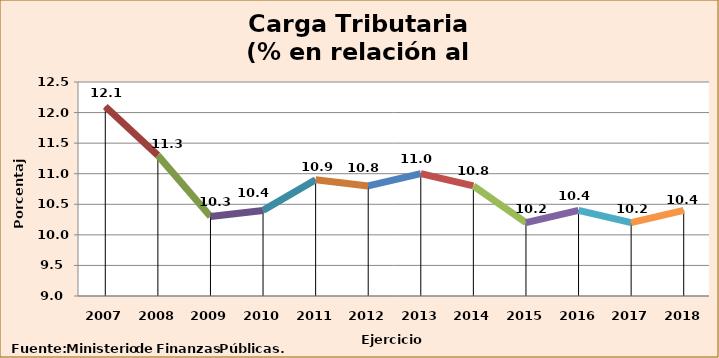
| Category | Series 0 |
|---|---|
| 2007 | 12.1 |
| 2008 | 11.3 |
| 2009 | 10.3 |
| 2010 | 10.4 |
| 2011 | 10.9 |
| 2012 | 10.8 |
| 2013 | 11 |
| 2014 | 10.8 |
| 2015 | 10.2 |
| 2016 | 10.4 |
| 2017 | 10.2 |
| 2018 | 10.4 |